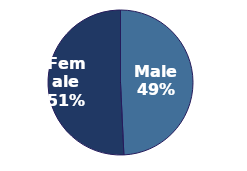
| Category | Series 0 |
|---|---|
| 0 | 0.492 |
| 1 | 0.507 |